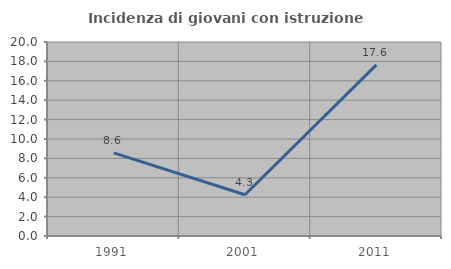
| Category | Incidenza di giovani con istruzione universitaria |
|---|---|
| 1991.0 | 8.571 |
| 2001.0 | 4.255 |
| 2011.0 | 17.647 |